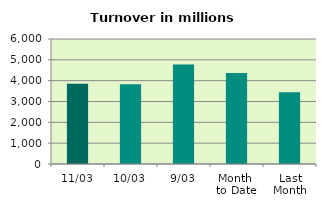
| Category | Series 0 |
|---|---|
| 11/03 | 3849.287 |
| 10/03 | 3828.49 |
| 9/03 | 4770.328 |
| Month 
to Date | 4365.91 |
| Last
Month | 3445.759 |